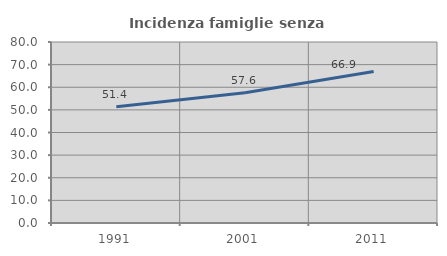
| Category | Incidenza famiglie senza nuclei |
|---|---|
| 1991.0 | 51.37 |
| 2001.0 | 57.576 |
| 2011.0 | 66.923 |